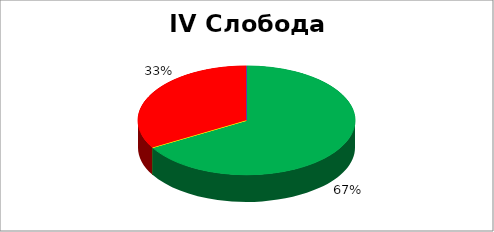
| Category | IV Слобода вероисповести |
|---|---|
| 0 | 0.667 |
| 1 | 0 |
| 2 | 0 |
| 3 | 0.333 |
| 4 | 0 |